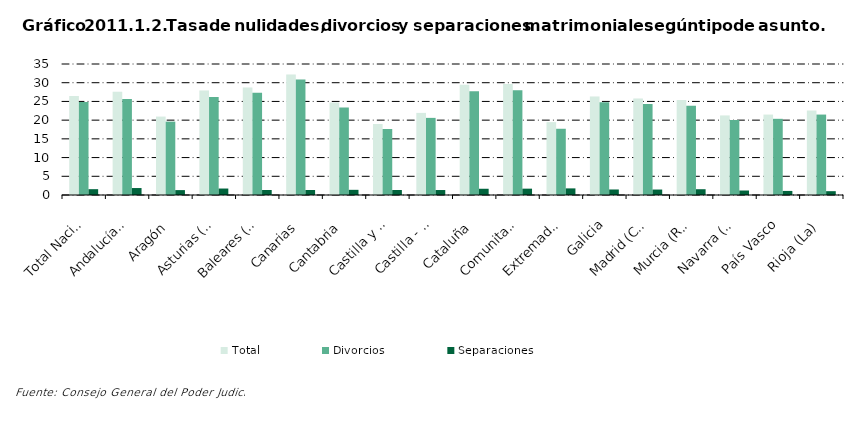
| Category | Total | Divorcios | Separaciones |
|---|---|---|---|
| Total Nacional | 26.425 | 24.831 | 1.557 |
| Andalucía(1) | 27.573 | 25.653 | 1.859 |
| Aragón | 20.954 | 19.609 | 1.307 |
| Asturias (Principado de) | 27.925 | 26.168 | 1.729 |
| Baleares (Illes) | 28.712 | 27.347 | 1.339 |
| Canarias | 32.227 | 30.864 | 1.335 |
| Cantabria | 24.734 | 23.351 | 1.383 |
| Castilla y León | 18.976 | 17.639 | 1.329 |
| Castilla - La Mancha | 21.945 | 20.607 | 1.328 |
| Cataluña | 29.444 | 27.735 | 1.667 |
| Comunitat Valenciana | 29.688 | 27.965 | 1.692 |
| Extremadura | 19.462 | 17.695 | 1.767 |
| Galicia | 26.329 | 24.78 | 1.474 |
| Madrid (Comunidad de) | 25.801 | 24.311 | 1.458 |
| Murcia (Región de) | 25.387 | 23.842 | 1.544 |
| Navarra (Comunidad Foral de) | 21.26 | 20.045 | 1.199 |
| País Vasco | 21.491 | 20.356 | 1.089 |
| Rioja (La) | 22.573 | 21.489 | 1.022 |